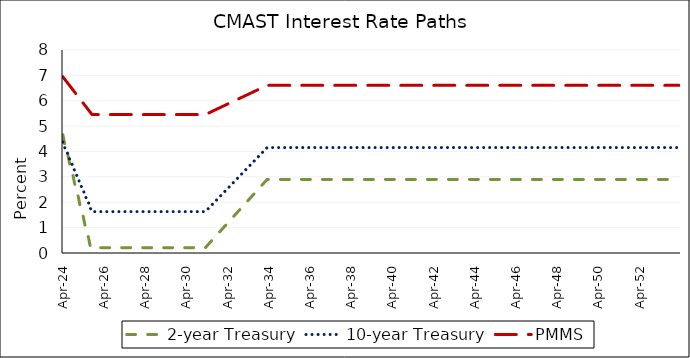
| Category | 2-year Treasury | 10-year Treasury | PMMS |
|---|---|---|---|
| 2024-04-30 | 4.658 | 4.373 | 6.942 |
| 2024-05-30 | 4.309 | 4.167 | 6.855 |
| 2024-06-30 | 4.077 | 4.03 | 6.767 |
| 2024-07-30 | 3.845 | 3.893 | 6.68 |
| 2024-08-30 | 3.496 | 3.687 | 6.592 |
| 2024-09-30 | 3.264 | 3.55 | 6.505 |
| 2024-10-30 | 3.032 | 3.413 | 6.417 |
| 2024-11-30 | 2.683 | 3.207 | 6.33 |
| 2024-12-30 | 2.451 | 3.07 | 6.242 |
| 2025-01-30 | 2.218 | 2.933 | 6.155 |
| 2025-02-28 | 1.87 | 2.727 | 6.067 |
| 2025-03-28 | 1.638 | 2.59 | 5.98 |
| 2025-04-28 | 1.405 | 2.453 | 5.892 |
| 2025-05-28 | 1.057 | 2.247 | 5.805 |
| 2025-06-28 | 0.825 | 2.11 | 5.717 |
| 2025-07-28 | 0.592 | 1.973 | 5.63 |
| 2025-08-28 | 0.244 | 1.767 | 5.542 |
| 2025-09-28 | 0.21 | 1.63 | 5.455 |
| 2025-10-28 | 0.21 | 1.63 | 5.455 |
| 2025-11-28 | 0.21 | 1.63 | 5.455 |
| 2025-12-28 | 0.21 | 1.63 | 5.455 |
| 2026-01-28 | 0.21 | 1.63 | 5.455 |
| 2026-02-28 | 0.21 | 1.63 | 5.455 |
| 2026-03-28 | 0.21 | 1.63 | 5.455 |
| 2026-04-28 | 0.21 | 1.63 | 5.455 |
| 2026-05-28 | 0.21 | 1.63 | 5.455 |
| 2026-06-28 | 0.21 | 1.63 | 5.455 |
| 2026-07-28 | 0.21 | 1.63 | 5.455 |
| 2026-08-28 | 0.21 | 1.63 | 5.455 |
| 2026-09-28 | 0.21 | 1.63 | 5.455 |
| 2026-10-28 | 0.21 | 1.63 | 5.455 |
| 2026-11-28 | 0.21 | 1.63 | 5.455 |
| 2026-12-28 | 0.21 | 1.63 | 5.455 |
| 2027-01-28 | 0.21 | 1.63 | 5.455 |
| 2027-02-28 | 0.21 | 1.63 | 5.455 |
| 2027-03-28 | 0.21 | 1.63 | 5.455 |
| 2027-04-28 | 0.21 | 1.63 | 5.455 |
| 2027-05-28 | 0.21 | 1.63 | 5.455 |
| 2027-06-28 | 0.21 | 1.63 | 5.455 |
| 2027-07-28 | 0.21 | 1.63 | 5.455 |
| 2027-08-28 | 0.21 | 1.63 | 5.455 |
| 2027-09-28 | 0.21 | 1.63 | 5.455 |
| 2027-10-28 | 0.21 | 1.63 | 5.455 |
| 2027-11-28 | 0.21 | 1.63 | 5.455 |
| 2027-12-28 | 0.21 | 1.63 | 5.455 |
| 2028-01-28 | 0.21 | 1.63 | 5.455 |
| 2028-02-28 | 0.21 | 1.63 | 5.455 |
| 2028-03-28 | 0.21 | 1.63 | 5.455 |
| 2028-04-28 | 0.21 | 1.63 | 5.455 |
| 2028-05-28 | 0.21 | 1.63 | 5.455 |
| 2028-06-28 | 0.21 | 1.63 | 5.455 |
| 2028-07-28 | 0.21 | 1.63 | 5.455 |
| 2028-08-28 | 0.21 | 1.63 | 5.455 |
| 2028-09-28 | 0.21 | 1.63 | 5.455 |
| 2028-10-28 | 0.21 | 1.63 | 5.455 |
| 2028-11-28 | 0.21 | 1.63 | 5.455 |
| 2028-12-28 | 0.21 | 1.63 | 5.455 |
| 2029-01-28 | 0.21 | 1.63 | 5.455 |
| 2029-02-28 | 0.21 | 1.63 | 5.455 |
| 2029-03-28 | 0.21 | 1.63 | 5.455 |
| 2029-04-28 | 0.21 | 1.63 | 5.455 |
| 2029-05-28 | 0.21 | 1.63 | 5.455 |
| 2029-06-28 | 0.21 | 1.63 | 5.455 |
| 2029-07-28 | 0.21 | 1.63 | 5.455 |
| 2029-08-28 | 0.21 | 1.63 | 5.455 |
| 2029-09-28 | 0.21 | 1.63 | 5.455 |
| 2029-10-28 | 0.21 | 1.63 | 5.455 |
| 2029-11-28 | 0.21 | 1.63 | 5.455 |
| 2029-12-28 | 0.21 | 1.63 | 5.455 |
| 2030-01-28 | 0.21 | 1.63 | 5.455 |
| 2030-02-28 | 0.21 | 1.63 | 5.455 |
| 2030-03-28 | 0.21 | 1.63 | 5.455 |
| 2030-04-28 | 0.21 | 1.63 | 5.455 |
| 2030-05-28 | 0.21 | 1.63 | 5.455 |
| 2030-06-28 | 0.21 | 1.63 | 5.455 |
| 2030-07-28 | 0.21 | 1.63 | 5.455 |
| 2030-08-28 | 0.21 | 1.63 | 5.455 |
| 2030-09-28 | 0.21 | 1.63 | 5.455 |
| 2030-10-28 | 0.21 | 1.63 | 5.455 |
| 2030-11-28 | 0.21 | 1.63 | 5.455 |
| 2030-12-28 | 0.21 | 1.63 | 5.455 |
| 2031-01-28 | 0.21 | 1.63 | 5.455 |
| 2031-02-28 | 0.21 | 1.63 | 5.455 |
| 2031-03-28 | 0.21 | 1.63 | 5.455 |
| 2031-04-28 | 0.285 | 1.7 | 5.487 |
| 2031-05-28 | 0.359 | 1.771 | 5.519 |
| 2031-06-28 | 0.434 | 1.841 | 5.551 |
| 2031-07-28 | 0.509 | 1.911 | 5.583 |
| 2031-08-28 | 0.584 | 1.981 | 5.615 |
| 2031-09-28 | 0.658 | 2.051 | 5.647 |
| 2031-10-28 | 0.733 | 2.121 | 5.679 |
| 2031-11-28 | 0.808 | 2.191 | 5.711 |
| 2031-12-28 | 0.883 | 2.261 | 5.743 |
| 2032-01-28 | 0.957 | 2.332 | 5.775 |
| 2032-02-28 | 1.032 | 2.402 | 5.807 |
| 2032-03-28 | 1.107 | 2.472 | 5.839 |
| 2032-04-28 | 1.181 | 2.542 | 5.871 |
| 2032-05-28 | 1.256 | 2.612 | 5.903 |
| 2032-06-28 | 1.331 | 2.682 | 5.935 |
| 2032-07-28 | 1.406 | 2.752 | 5.967 |
| 2032-08-28 | 1.48 | 2.823 | 5.999 |
| 2032-09-28 | 1.555 | 2.893 | 6.031 |
| 2032-10-28 | 1.63 | 2.963 | 6.063 |
| 2032-11-28 | 1.704 | 3.033 | 6.095 |
| 2032-12-28 | 1.779 | 3.103 | 6.127 |
| 2033-01-28 | 1.854 | 3.173 | 6.159 |
| 2033-02-28 | 1.929 | 3.243 | 6.191 |
| 2033-03-28 | 2.003 | 3.313 | 6.223 |
| 2033-04-28 | 2.078 | 3.384 | 6.255 |
| 2033-05-28 | 2.153 | 3.454 | 6.287 |
| 2033-06-28 | 2.228 | 3.524 | 6.319 |
| 2033-07-28 | 2.302 | 3.594 | 6.35 |
| 2033-08-28 | 2.377 | 3.664 | 6.382 |
| 2033-09-28 | 2.452 | 3.734 | 6.414 |
| 2033-10-28 | 2.526 | 3.804 | 6.446 |
| 2033-11-28 | 2.601 | 3.875 | 6.478 |
| 2033-12-28 | 2.676 | 3.945 | 6.51 |
| 2034-01-28 | 2.751 | 4.015 | 6.542 |
| 2034-02-28 | 2.825 | 4.085 | 6.574 |
| 2034-03-28 | 2.9 | 4.155 | 6.606 |
| 2034-04-28 | 2.9 | 4.155 | 6.606 |
| 2034-05-28 | 2.9 | 4.155 | 6.606 |
| 2034-06-28 | 2.9 | 4.155 | 6.606 |
| 2034-07-28 | 2.9 | 4.155 | 6.606 |
| 2034-08-28 | 2.9 | 4.155 | 6.606 |
| 2034-09-28 | 2.9 | 4.155 | 6.606 |
| 2034-10-28 | 2.9 | 4.155 | 6.606 |
| 2034-11-28 | 2.9 | 4.155 | 6.606 |
| 2034-12-28 | 2.9 | 4.155 | 6.606 |
| 2035-01-28 | 2.9 | 4.155 | 6.606 |
| 2035-02-28 | 2.9 | 4.155 | 6.606 |
| 2035-03-28 | 2.9 | 4.155 | 6.606 |
| 2035-04-28 | 2.9 | 4.155 | 6.606 |
| 2035-05-28 | 2.9 | 4.155 | 6.606 |
| 2035-06-28 | 2.9 | 4.155 | 6.606 |
| 2035-07-28 | 2.9 | 4.155 | 6.606 |
| 2035-08-28 | 2.9 | 4.155 | 6.606 |
| 2035-09-28 | 2.9 | 4.155 | 6.606 |
| 2035-10-28 | 2.9 | 4.155 | 6.606 |
| 2035-11-28 | 2.9 | 4.155 | 6.606 |
| 2035-12-28 | 2.9 | 4.155 | 6.606 |
| 2036-01-28 | 2.9 | 4.155 | 6.606 |
| 2036-02-28 | 2.9 | 4.155 | 6.606 |
| 2036-03-28 | 2.9 | 4.155 | 6.606 |
| 2036-04-28 | 2.9 | 4.155 | 6.606 |
| 2036-05-28 | 2.9 | 4.155 | 6.606 |
| 2036-06-28 | 2.9 | 4.155 | 6.606 |
| 2036-07-28 | 2.9 | 4.155 | 6.606 |
| 2036-08-28 | 2.9 | 4.155 | 6.606 |
| 2036-09-28 | 2.9 | 4.155 | 6.606 |
| 2036-10-28 | 2.9 | 4.155 | 6.606 |
| 2036-11-28 | 2.9 | 4.155 | 6.606 |
| 2036-12-28 | 2.9 | 4.155 | 6.606 |
| 2037-01-28 | 2.9 | 4.155 | 6.606 |
| 2037-02-28 | 2.9 | 4.155 | 6.606 |
| 2037-03-28 | 2.9 | 4.155 | 6.606 |
| 2037-04-28 | 2.9 | 4.155 | 6.606 |
| 2037-05-28 | 2.9 | 4.155 | 6.606 |
| 2037-06-28 | 2.9 | 4.155 | 6.606 |
| 2037-07-28 | 2.9 | 4.155 | 6.606 |
| 2037-08-28 | 2.9 | 4.155 | 6.606 |
| 2037-09-28 | 2.9 | 4.155 | 6.606 |
| 2037-10-28 | 2.9 | 4.155 | 6.606 |
| 2037-11-28 | 2.9 | 4.155 | 6.606 |
| 2037-12-28 | 2.9 | 4.155 | 6.606 |
| 2038-01-28 | 2.9 | 4.155 | 6.606 |
| 2038-02-28 | 2.9 | 4.155 | 6.606 |
| 2038-03-28 | 2.9 | 4.155 | 6.606 |
| 2038-04-28 | 2.9 | 4.155 | 6.606 |
| 2038-05-28 | 2.9 | 4.155 | 6.606 |
| 2038-06-28 | 2.9 | 4.155 | 6.606 |
| 2038-07-28 | 2.9 | 4.155 | 6.606 |
| 2038-08-28 | 2.9 | 4.155 | 6.606 |
| 2038-09-28 | 2.9 | 4.155 | 6.606 |
| 2038-10-28 | 2.9 | 4.155 | 6.606 |
| 2038-11-28 | 2.9 | 4.155 | 6.606 |
| 2038-12-28 | 2.9 | 4.155 | 6.606 |
| 2039-01-28 | 2.9 | 4.155 | 6.606 |
| 2039-02-28 | 2.9 | 4.155 | 6.606 |
| 2039-03-28 | 2.9 | 4.155 | 6.606 |
| 2039-04-28 | 2.9 | 4.155 | 6.606 |
| 2039-05-28 | 2.9 | 4.155 | 6.606 |
| 2039-06-28 | 2.9 | 4.155 | 6.606 |
| 2039-07-28 | 2.9 | 4.155 | 6.606 |
| 2039-08-28 | 2.9 | 4.155 | 6.606 |
| 2039-09-28 | 2.9 | 4.155 | 6.606 |
| 2039-10-28 | 2.9 | 4.155 | 6.606 |
| 2039-11-28 | 2.9 | 4.155 | 6.606 |
| 2039-12-28 | 2.9 | 4.155 | 6.606 |
| 2040-01-28 | 2.9 | 4.155 | 6.606 |
| 2040-02-28 | 2.9 | 4.155 | 6.606 |
| 2040-03-28 | 2.9 | 4.155 | 6.606 |
| 2040-04-28 | 2.9 | 4.155 | 6.606 |
| 2040-05-28 | 2.9 | 4.155 | 6.606 |
| 2040-06-28 | 2.9 | 4.155 | 6.606 |
| 2040-07-28 | 2.9 | 4.155 | 6.606 |
| 2040-08-28 | 2.9 | 4.155 | 6.606 |
| 2040-09-28 | 2.9 | 4.155 | 6.606 |
| 2040-10-28 | 2.9 | 4.155 | 6.606 |
| 2040-11-28 | 2.9 | 4.155 | 6.606 |
| 2040-12-28 | 2.9 | 4.155 | 6.606 |
| 2041-01-28 | 2.9 | 4.155 | 6.606 |
| 2041-02-28 | 2.9 | 4.155 | 6.606 |
| 2041-03-28 | 2.9 | 4.155 | 6.606 |
| 2041-04-28 | 2.9 | 4.155 | 6.606 |
| 2041-05-28 | 2.9 | 4.155 | 6.606 |
| 2041-06-28 | 2.9 | 4.155 | 6.606 |
| 2041-07-28 | 2.9 | 4.155 | 6.606 |
| 2041-08-28 | 2.9 | 4.155 | 6.606 |
| 2041-09-28 | 2.9 | 4.155 | 6.606 |
| 2041-10-28 | 2.9 | 4.155 | 6.606 |
| 2041-11-28 | 2.9 | 4.155 | 6.606 |
| 2041-12-28 | 2.9 | 4.155 | 6.606 |
| 2042-01-28 | 2.9 | 4.155 | 6.606 |
| 2042-02-28 | 2.9 | 4.155 | 6.606 |
| 2042-03-28 | 2.9 | 4.155 | 6.606 |
| 2042-04-28 | 2.9 | 4.155 | 6.606 |
| 2042-05-28 | 2.9 | 4.155 | 6.606 |
| 2042-06-28 | 2.9 | 4.155 | 6.606 |
| 2042-07-28 | 2.9 | 4.155 | 6.606 |
| 2042-08-28 | 2.9 | 4.155 | 6.606 |
| 2042-09-28 | 2.9 | 4.155 | 6.606 |
| 2042-10-28 | 2.9 | 4.155 | 6.606 |
| 2042-11-28 | 2.9 | 4.155 | 6.606 |
| 2042-12-28 | 2.9 | 4.155 | 6.606 |
| 2043-01-28 | 2.9 | 4.155 | 6.606 |
| 2043-02-28 | 2.9 | 4.155 | 6.606 |
| 2043-03-28 | 2.9 | 4.155 | 6.606 |
| 2043-04-28 | 2.9 | 4.155 | 6.606 |
| 2043-05-28 | 2.9 | 4.155 | 6.606 |
| 2043-06-28 | 2.9 | 4.155 | 6.606 |
| 2043-07-28 | 2.9 | 4.155 | 6.606 |
| 2043-08-28 | 2.9 | 4.155 | 6.606 |
| 2043-09-28 | 2.9 | 4.155 | 6.606 |
| 2043-10-28 | 2.9 | 4.155 | 6.606 |
| 2043-11-28 | 2.9 | 4.155 | 6.606 |
| 2043-12-28 | 2.9 | 4.155 | 6.606 |
| 2044-01-28 | 2.9 | 4.155 | 6.606 |
| 2044-02-28 | 2.9 | 4.155 | 6.606 |
| 2044-03-28 | 2.9 | 4.155 | 6.606 |
| 2044-04-28 | 2.9 | 4.155 | 6.606 |
| 2044-05-28 | 2.9 | 4.155 | 6.606 |
| 2044-06-28 | 2.9 | 4.155 | 6.606 |
| 2044-07-28 | 2.9 | 4.155 | 6.606 |
| 2044-08-28 | 2.9 | 4.155 | 6.606 |
| 2044-09-28 | 2.9 | 4.155 | 6.606 |
| 2044-10-28 | 2.9 | 4.155 | 6.606 |
| 2044-11-28 | 2.9 | 4.155 | 6.606 |
| 2044-12-28 | 2.9 | 4.155 | 6.606 |
| 2045-01-28 | 2.9 | 4.155 | 6.606 |
| 2045-02-28 | 2.9 | 4.155 | 6.606 |
| 2045-03-28 | 2.9 | 4.155 | 6.606 |
| 2045-04-28 | 2.9 | 4.155 | 6.606 |
| 2045-05-28 | 2.9 | 4.155 | 6.606 |
| 2045-06-28 | 2.9 | 4.155 | 6.606 |
| 2045-07-28 | 2.9 | 4.155 | 6.606 |
| 2045-08-28 | 2.9 | 4.155 | 6.606 |
| 2045-09-28 | 2.9 | 4.155 | 6.606 |
| 2045-10-28 | 2.9 | 4.155 | 6.606 |
| 2045-11-28 | 2.9 | 4.155 | 6.606 |
| 2045-12-28 | 2.9 | 4.155 | 6.606 |
| 2046-01-28 | 2.9 | 4.155 | 6.606 |
| 2046-02-28 | 2.9 | 4.155 | 6.606 |
| 2046-03-28 | 2.9 | 4.155 | 6.606 |
| 2046-04-28 | 2.9 | 4.155 | 6.606 |
| 2046-05-28 | 2.9 | 4.155 | 6.606 |
| 2046-06-28 | 2.9 | 4.155 | 6.606 |
| 2046-07-28 | 2.9 | 4.155 | 6.606 |
| 2046-08-28 | 2.9 | 4.155 | 6.606 |
| 2046-09-28 | 2.9 | 4.155 | 6.606 |
| 2046-10-28 | 2.9 | 4.155 | 6.606 |
| 2046-11-28 | 2.9 | 4.155 | 6.606 |
| 2046-12-28 | 2.9 | 4.155 | 6.606 |
| 2047-01-28 | 2.9 | 4.155 | 6.606 |
| 2047-02-28 | 2.9 | 4.155 | 6.606 |
| 2047-03-28 | 2.9 | 4.155 | 6.606 |
| 2047-04-28 | 2.9 | 4.155 | 6.606 |
| 2047-05-28 | 2.9 | 4.155 | 6.606 |
| 2047-06-28 | 2.9 | 4.155 | 6.606 |
| 2047-07-28 | 2.9 | 4.155 | 6.606 |
| 2047-08-28 | 2.9 | 4.155 | 6.606 |
| 2047-09-28 | 2.9 | 4.155 | 6.606 |
| 2047-10-28 | 2.9 | 4.155 | 6.606 |
| 2047-11-28 | 2.9 | 4.155 | 6.606 |
| 2047-12-28 | 2.9 | 4.155 | 6.606 |
| 2048-01-28 | 2.9 | 4.155 | 6.606 |
| 2048-02-28 | 2.9 | 4.155 | 6.606 |
| 2048-03-28 | 2.9 | 4.155 | 6.606 |
| 2048-04-28 | 2.9 | 4.155 | 6.606 |
| 2048-05-28 | 2.9 | 4.155 | 6.606 |
| 2048-06-28 | 2.9 | 4.155 | 6.606 |
| 2048-07-28 | 2.9 | 4.155 | 6.606 |
| 2048-08-28 | 2.9 | 4.155 | 6.606 |
| 2048-09-28 | 2.9 | 4.155 | 6.606 |
| 2048-10-28 | 2.9 | 4.155 | 6.606 |
| 2048-11-28 | 2.9 | 4.155 | 6.606 |
| 2048-12-28 | 2.9 | 4.155 | 6.606 |
| 2049-01-28 | 2.9 | 4.155 | 6.606 |
| 2049-02-28 | 2.9 | 4.155 | 6.606 |
| 2049-03-28 | 2.9 | 4.155 | 6.606 |
| 2049-04-28 | 2.9 | 4.155 | 6.606 |
| 2049-05-28 | 2.9 | 4.155 | 6.606 |
| 2049-06-28 | 2.9 | 4.155 | 6.606 |
| 2049-07-28 | 2.9 | 4.155 | 6.606 |
| 2049-08-28 | 2.9 | 4.155 | 6.606 |
| 2049-09-28 | 2.9 | 4.155 | 6.606 |
| 2049-10-28 | 2.9 | 4.155 | 6.606 |
| 2049-11-28 | 2.9 | 4.155 | 6.606 |
| 2049-12-28 | 2.9 | 4.155 | 6.606 |
| 2050-01-28 | 2.9 | 4.155 | 6.606 |
| 2050-02-28 | 2.9 | 4.155 | 6.606 |
| 2050-03-28 | 2.9 | 4.155 | 6.606 |
| 2050-04-28 | 2.9 | 4.155 | 6.606 |
| 2050-05-28 | 2.9 | 4.155 | 6.606 |
| 2050-06-28 | 2.9 | 4.155 | 6.606 |
| 2050-07-28 | 2.9 | 4.155 | 6.606 |
| 2050-08-28 | 2.9 | 4.155 | 6.606 |
| 2050-09-28 | 2.9 | 4.155 | 6.606 |
| 2050-10-28 | 2.9 | 4.155 | 6.606 |
| 2050-11-28 | 2.9 | 4.155 | 6.606 |
| 2050-12-28 | 2.9 | 4.155 | 6.606 |
| 2051-01-28 | 2.9 | 4.155 | 6.606 |
| 2051-02-28 | 2.9 | 4.155 | 6.606 |
| 2051-03-28 | 2.9 | 4.155 | 6.606 |
| 2051-04-28 | 2.9 | 4.155 | 6.606 |
| 2051-05-28 | 2.9 | 4.155 | 6.606 |
| 2051-06-28 | 2.9 | 4.155 | 6.606 |
| 2051-07-28 | 2.9 | 4.155 | 6.606 |
| 2051-08-28 | 2.9 | 4.155 | 6.606 |
| 2051-09-28 | 2.9 | 4.155 | 6.606 |
| 2051-10-28 | 2.9 | 4.155 | 6.606 |
| 2051-11-28 | 2.9 | 4.155 | 6.606 |
| 2051-12-28 | 2.9 | 4.155 | 6.606 |
| 2052-01-28 | 2.9 | 4.155 | 6.606 |
| 2052-02-28 | 2.9 | 4.155 | 6.606 |
| 2052-03-28 | 2.9 | 4.155 | 6.606 |
| 2052-04-28 | 2.9 | 4.155 | 6.606 |
| 2052-05-28 | 2.9 | 4.155 | 6.606 |
| 2052-06-28 | 2.9 | 4.155 | 6.606 |
| 2052-07-28 | 2.9 | 4.155 | 6.606 |
| 2052-08-28 | 2.9 | 4.155 | 6.606 |
| 2052-09-28 | 2.9 | 4.155 | 6.606 |
| 2052-10-28 | 2.9 | 4.155 | 6.606 |
| 2052-11-28 | 2.9 | 4.155 | 6.606 |
| 2052-12-28 | 2.9 | 4.155 | 6.606 |
| 2053-01-28 | 2.9 | 4.155 | 6.606 |
| 2053-02-28 | 2.9 | 4.155 | 6.606 |
| 2053-03-28 | 2.9 | 4.155 | 6.606 |
| 2053-04-28 | 2.9 | 4.155 | 6.606 |
| 2053-05-28 | 2.9 | 4.155 | 6.606 |
| 2053-06-28 | 2.9 | 4.155 | 6.606 |
| 2053-07-28 | 2.9 | 4.155 | 6.606 |
| 2053-08-28 | 2.9 | 4.155 | 6.606 |
| 2053-09-28 | 2.9 | 4.155 | 6.606 |
| 2053-10-28 | 2.9 | 4.155 | 6.606 |
| 2053-11-28 | 2.9 | 4.155 | 6.606 |
| 2053-12-28 | 2.9 | 4.155 | 6.606 |
| 2054-01-28 | 2.9 | 4.155 | 6.606 |
| 2054-02-28 | 2.9 | 4.155 | 6.606 |
| 2054-03-28 | 2.9 | 4.155 | 6.606 |